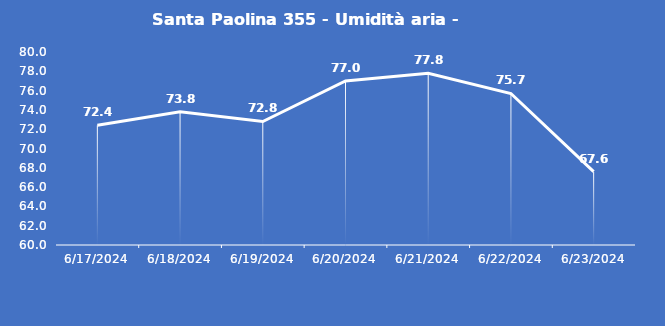
| Category | Santa Paolina 355 - Umidità aria - Grezzo (%) |
|---|---|
| 6/17/24 | 72.4 |
| 6/18/24 | 73.8 |
| 6/19/24 | 72.8 |
| 6/20/24 | 77 |
| 6/21/24 | 77.8 |
| 6/22/24 | 75.7 |
| 6/23/24 | 67.6 |